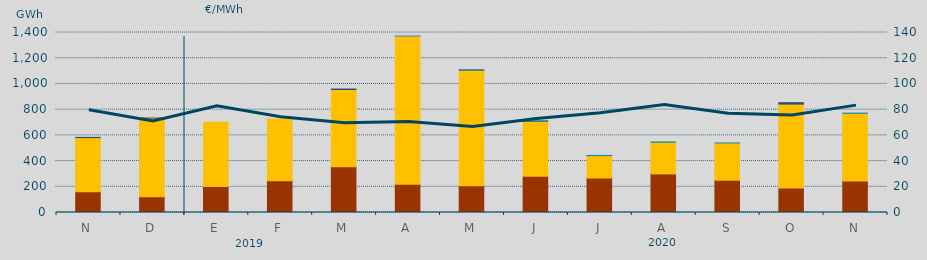
| Category | Carbón | Ciclo Combinado | Consumo Bombeo | Hidráulica | Otras Renovables | Turbinación bombeo |
|---|---|---|---|---|---|---|
| N | 161365 | 421030.7 | 0 | 0 | 1775.2 | 0 |
| D | 122168 | 612250.1 | 0 | 0 | 164.2 | 0 |
| E | 202940 | 498564 | 0 | 0 | 0 | 0 |
| F | 247227 | 479450.3 | 0 | 0 | 0 | 0 |
| M | 355297 | 601360.3 | 3495.6 | 0 | 0 | 0 |
| A | 220571 | 1152051.4 | 585 | 0 | 0 | 5000 |
| M | 207721 | 900435.9 | 185 | 630 | 0 | 0 |
| J | 281442 | 429259.5 | 370 | 680 | 0 | 0 |
| J | 268136 | 174851.8 | 11.5 | 1020 | 0 | 0 |
| A | 300478 | 246096.4 | 0 | 2161.8 | 0 | 0 |
| S | 250957 | 289538.3 | 0 | 33.4 | 0 | 0 |
| O | 189825 | 653476.1 | 10686 | 0 | 0 | 0 |
| N | 244862 | 526555 | 0 | 1376.6 | 0 | 0 |